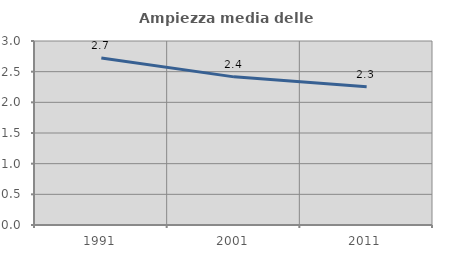
| Category | Ampiezza media delle famiglie |
|---|---|
| 1991.0 | 2.723 |
| 2001.0 | 2.415 |
| 2011.0 | 2.256 |